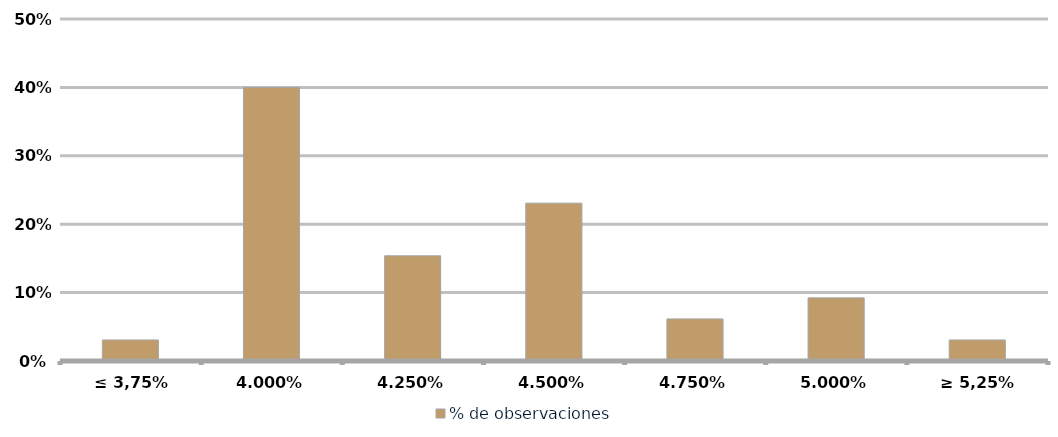
| Category | % de observaciones  |
|---|---|
| ≤ 3,75% | 0.031 |
| 4,00% | 0.4 |
| 4,25% | 0.154 |
| 4,50% | 0.231 |
| 4,75% | 0.062 |
| 5,00% | 0.092 |
| ≥ 5,25% | 0.031 |